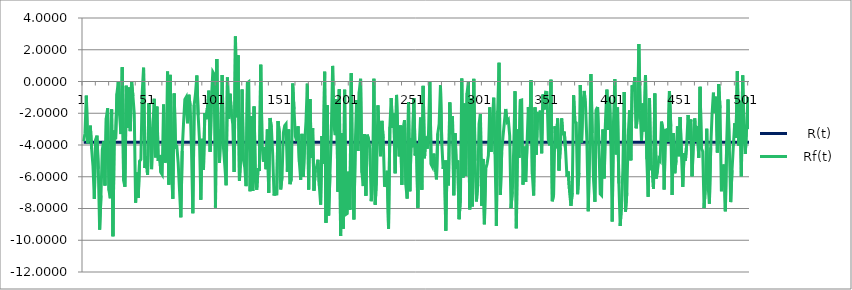
| Category |     R(t) |    Rf(t) |
|---|---|---|
| 0 | -3.82 | -3.77 |
| 1 | -3.82 | -3.253 |
| 2 | -3.82 | -0.888 |
| 3 | -3.82 | -3.89 |
| 4 | -3.82 | -3.398 |
| 5 | -3.82 | -2.78 |
| 6 | -3.82 | -4.243 |
| 7 | -3.82 | -5.334 |
| 8 | -3.82 | -7.394 |
| 9 | -3.82 | -3.652 |
| 10 | -3.82 | -3.412 |
| 11 | -3.82 | -5.506 |
| 12 | -3.82 | -9.331 |
| 13 | -3.82 | -7.177 |
| 14 | -3.82 | -4.293 |
| 15 | -3.82 | -3.78 |
| 16 | -3.82 | -6.547 |
| 17 | -3.82 | -2.295 |
| 18 | -3.82 | -1.691 |
| 19 | -3.82 | -6.859 |
| 20 | -3.82 | -7.35 |
| 21 | -3.82 | -1.757 |
| 22 | -3.82 | -9.746 |
| 23 | -3.82 | -3.085 |
| 24 | -3.82 | -3.636 |
| 25 | -3.82 | -0.752 |
| 26 | -3.82 | -0.033 |
| 27 | -3.82 | -2.132 |
| 28 | -3.82 | -3.308 |
| 29 | -3.82 | 0.895 |
| 30 | -3.82 | -6.239 |
| 31 | -3.82 | -6.629 |
| 32 | -3.82 | -0.265 |
| 33 | -3.82 | -2.911 |
| 34 | -3.82 | -0.381 |
| 35 | -3.82 | -3.126 |
| 36 | -3.82 | 0.019 |
| 37 | -3.82 | -0.925 |
| 38 | -3.82 | -2.024 |
| 39 | -3.82 | -7.632 |
| 40 | -3.82 | -5.738 |
| 41 | -3.82 | -7.324 |
| 42 | -3.82 | -5.008 |
| 43 | -3.82 | -4.906 |
| 44 | -3.82 | -0.662 |
| 45 | -3.82 | 0.871 |
| 46 | -3.82 | -5.452 |
| 47 | -3.82 | -4.727 |
| 48 | -3.82 | -5.891 |
| 49 | -3.82 | -1.372 |
| 50 | -3.82 | -3.266 |
| 51 | -3.82 | -5.519 |
| 52 | -3.82 | -2.876 |
| 53 | -3.82 | -1.092 |
| 54 | -3.82 | -4.779 |
| 55 | -3.82 | -1.58 |
| 56 | -3.82 | -5 |
| 57 | -3.82 | -4.629 |
| 58 | -3.82 | -5.729 |
| 59 | -3.82 | -5.864 |
| 60 | -3.82 | -1.45 |
| 61 | -3.82 | -5.109 |
| 62 | -3.82 | -4.922 |
| 63 | -3.82 | 0.625 |
| 64 | -3.82 | -6.495 |
| 65 | -3.82 | 0.418 |
| 66 | -3.82 | -5.81 |
| 67 | -3.82 | -7.392 |
| 68 | -3.82 | -0.758 |
| 69 | -3.82 | -4.139 |
| 70 | -3.82 | -4.095 |
| 71 | -3.82 | -5.137 |
| 72 | -3.82 | -6.862 |
| 73 | -3.82 | -8.555 |
| 74 | -3.82 | -4.374 |
| 75 | -3.82 | -2.66 |
| 76 | -3.82 | -1.125 |
| 77 | -3.82 | -0.984 |
| 78 | -3.82 | -2.628 |
| 79 | -3.82 | -0.837 |
| 80 | -3.82 | -1.535 |
| 81 | -3.82 | -4.315 |
| 82 | -3.82 | -8.296 |
| 83 | -3.82 | -1.484 |
| 84 | -3.82 | -0.774 |
| 85 | -3.82 | 0.378 |
| 86 | -3.82 | -2.13 |
| 87 | -3.82 | -3.709 |
| 88 | -3.82 | -7.444 |
| 89 | -3.82 | -3.612 |
| 90 | -3.82 | -5.557 |
| 91 | -3.82 | -1.986 |
| 92 | -3.82 | -2.376 |
| 93 | -3.82 | -1.616 |
| 94 | -3.82 | -0.576 |
| 95 | -3.82 | -4.42 |
| 96 | -3.82 | -1.086 |
| 97 | -3.82 | 0.612 |
| 98 | -3.82 | 0.468 |
| 99 | -3.82 | -7.944 |
| 100 | -3.82 | 1.419 |
| 101 | -3.82 | -3.698 |
| 102 | -3.82 | -5.135 |
| 103 | -3.82 | -3.002 |
| 104 | -3.82 | 0.41 |
| 105 | -3.82 | -4.165 |
| 106 | -3.82 | -5.272 |
| 107 | -3.82 | -6.535 |
| 108 | -3.82 | 0.251 |
| 109 | -3.82 | -2.34 |
| 110 | -3.82 | -0.771 |
| 111 | -3.82 | -2.041 |
| 112 | -3.82 | -2.675 |
| 113 | -3.82 | -5.699 |
| 114 | -3.82 | 2.84 |
| 115 | -3.82 | -2.253 |
| 116 | -3.82 | 1.648 |
| 117 | -3.82 | -6.251 |
| 118 | -3.82 | -4.736 |
| 119 | -3.82 | -0.503 |
| 120 | -3.82 | -4.949 |
| 121 | -3.82 | -5.396 |
| 122 | -3.82 | -6.592 |
| 123 | -3.82 | -0.079 |
| 124 | -3.82 | -0.015 |
| 125 | -3.82 | -6.909 |
| 126 | -3.82 | -2.176 |
| 127 | -3.82 | -6.892 |
| 128 | -3.82 | -1.577 |
| 129 | -3.82 | -6.271 |
| 130 | -3.82 | -6.815 |
| 131 | -3.82 | -5.451 |
| 132 | -3.82 | -5.644 |
| 133 | -3.82 | 1.057 |
| 134 | -3.82 | -3.941 |
| 135 | -3.82 | -5.048 |
| 136 | -3.82 | -4.12 |
| 137 | -3.82 | -5.522 |
| 138 | -3.82 | -3.023 |
| 139 | -3.82 | -7.015 |
| 140 | -3.82 | -2.302 |
| 141 | -3.82 | -2.893 |
| 142 | -3.82 | -4.617 |
| 143 | -3.82 | -7.183 |
| 144 | -3.82 | -6.876 |
| 145 | -3.82 | -7.164 |
| 146 | -3.82 | -2.496 |
| 147 | -3.82 | -3.234 |
| 148 | -3.82 | -6.798 |
| 149 | -3.82 | -6.018 |
| 150 | -3.82 | -3.233 |
| 151 | -3.82 | -2.776 |
| 152 | -3.82 | -2.671 |
| 153 | -3.82 | -5.691 |
| 154 | -3.82 | -3.025 |
| 155 | -3.82 | -6.466 |
| 156 | -3.82 | -6.135 |
| 157 | -3.82 | -0.128 |
| 158 | -3.82 | -1.76 |
| 159 | -3.82 | -3.446 |
| 160 | -3.82 | -3.754 |
| 161 | -3.82 | -2.828 |
| 162 | -3.82 | -5.065 |
| 163 | -3.82 | -6.19 |
| 164 | -3.82 | -3.3 |
| 165 | -3.82 | -5.998 |
| 166 | -3.82 | -3.9 |
| 167 | -3.82 | -2.504 |
| 168 | -3.82 | -0.136 |
| 169 | -3.82 | -6.801 |
| 170 | -3.82 | -1.109 |
| 171 | -3.82 | -4.819 |
| 172 | -3.82 | -2.936 |
| 173 | -3.82 | -6.874 |
| 174 | -3.82 | -5.535 |
| 175 | -3.82 | -5.355 |
| 176 | -3.82 | -4.931 |
| 177 | -3.82 | -6.556 |
| 178 | -3.82 | -7.757 |
| 179 | -3.82 | -3.431 |
| 180 | -3.82 | -5.187 |
| 181 | -3.82 | 0.614 |
| 182 | -3.82 | -8.897 |
| 183 | -3.82 | -1.496 |
| 184 | -3.82 | -8.439 |
| 185 | -3.82 | -5.838 |
| 186 | -3.82 | -3.305 |
| 187 | -3.82 | 0.982 |
| 188 | -3.82 | -2.844 |
| 189 | -3.82 | -3.378 |
| 190 | -3.82 | -1.103 |
| 191 | -3.82 | -6.95 |
| 192 | -3.82 | -0.482 |
| 193 | -3.82 | -9.737 |
| 194 | -3.82 | -3.256 |
| 195 | -3.82 | -9.268 |
| 196 | -3.82 | -0.513 |
| 197 | -3.82 | -8.365 |
| 198 | -3.82 | -8.305 |
| 199 | -3.82 | -5.678 |
| 200 | -3.82 | -8.071 |
| 201 | -3.82 | 0.524 |
| 202 | -3.82 | -6.609 |
| 203 | -3.82 | -8.688 |
| 204 | -3.82 | -4.058 |
| 205 | -3.82 | -1.17 |
| 206 | -3.82 | -4.378 |
| 207 | -3.82 | -0.626 |
| 208 | -3.82 | 0.168 |
| 209 | -3.82 | -5.749 |
| 210 | -3.82 | -6.587 |
| 211 | -3.82 | -3.31 |
| 212 | -3.82 | -7.196 |
| 213 | -3.82 | -3.353 |
| 214 | -3.82 | -3.643 |
| 215 | -3.82 | -4.248 |
| 216 | -3.82 | -7.538 |
| 217 | -3.82 | -6.139 |
| 218 | -3.82 | 0.171 |
| 219 | -3.82 | -7.759 |
| 220 | -3.82 | -5.974 |
| 221 | -3.82 | -1.506 |
| 222 | -3.82 | -3.344 |
| 223 | -3.82 | -4.708 |
| 224 | -3.82 | -2.483 |
| 225 | -3.82 | -3.586 |
| 226 | -3.82 | -6.63 |
| 227 | -3.82 | -6.35 |
| 228 | -3.82 | -5.622 |
| 229 | -3.82 | -9.268 |
| 230 | -3.82 | -2.849 |
| 231 | -3.82 | -1.036 |
| 232 | -3.82 | -2.923 |
| 233 | -3.82 | -2.018 |
| 234 | -3.82 | -5.78 |
| 235 | -3.82 | -0.845 |
| 236 | -3.82 | -3.515 |
| 237 | -3.82 | -4.714 |
| 238 | -3.82 | -2.77 |
| 239 | -3.82 | -6.503 |
| 240 | -3.82 | -2.958 |
| 241 | -3.82 | -2.442 |
| 242 | -3.82 | -6.51 |
| 243 | -3.82 | -7.374 |
| 244 | -3.82 | -1.302 |
| 245 | -3.82 | -6.91 |
| 246 | -3.82 | -3.573 |
| 247 | -3.82 | -4.138 |
| 248 | -3.82 | -1.049 |
| 249 | -3.82 | -4.658 |
| 250 | -3.82 | -3.928 |
| 251 | -3.82 | -7.949 |
| 252 | -3.82 | -4.167 |
| 253 | -3.82 | -2.267 |
| 254 | -3.82 | -6.82 |
| 255 | -3.82 | -0.275 |
| 256 | -3.82 | -4.83 |
| 257 | -3.82 | -3.47 |
| 258 | -3.82 | -4.223 |
| 259 | -3.82 | -3.343 |
| 260 | -3.82 | 0.008 |
| 261 | -3.82 | -5.218 |
| 262 | -3.82 | -5.386 |
| 263 | -3.82 | -4.537 |
| 264 | -3.82 | -5.431 |
| 265 | -3.82 | -6.164 |
| 266 | -3.82 | -3.27 |
| 267 | -3.82 | -2.675 |
| 268 | -3.82 | -0.232 |
| 269 | -3.82 | -3.901 |
| 270 | -3.82 | -5.511 |
| 271 | -3.82 | -4.982 |
| 272 | -3.82 | -9.393 |
| 273 | -3.82 | -4.971 |
| 274 | -3.82 | -6.542 |
| 275 | -3.82 | -1.324 |
| 276 | -3.82 | -3.317 |
| 277 | -3.82 | -2.173 |
| 278 | -3.82 | -7.16 |
| 279 | -3.82 | -3.257 |
| 280 | -3.82 | -5.511 |
| 281 | -3.82 | -4.978 |
| 282 | -3.82 | -8.672 |
| 283 | -3.82 | -7.352 |
| 284 | -3.82 | 0.184 |
| 285 | -3.82 | -6.045 |
| 286 | -3.82 | -1.388 |
| 287 | -3.82 | -5.952 |
| 288 | -3.82 | -0.721 |
| 289 | -3.82 | -0.022 |
| 290 | -3.82 | -8.055 |
| 291 | -3.82 | -1.064 |
| 292 | -3.82 | -7.866 |
| 293 | -3.82 | 0.165 |
| 294 | -3.82 | -4.993 |
| 295 | -3.82 | -7.556 |
| 296 | -3.82 | -6.484 |
| 297 | -3.82 | -2.661 |
| 298 | -3.82 | -2.045 |
| 299 | -3.82 | -7.831 |
| 300 | -3.82 | -4.877 |
| 301 | -3.82 | -8.996 |
| 302 | -3.82 | -5.508 |
| 303 | -3.82 | -5.186 |
| 304 | -3.82 | -4.659 |
| 305 | -3.82 | -1.631 |
| 306 | -3.82 | -4.433 |
| 307 | -3.82 | -2.444 |
| 308 | -3.82 | -1.019 |
| 309 | -3.82 | -4.574 |
| 310 | -3.82 | -9.102 |
| 311 | -3.82 | -1.844 |
| 312 | -3.82 | 1.177 |
| 313 | -3.82 | -7.144 |
| 314 | -3.82 | -4.458 |
| 315 | -3.82 | -3.441 |
| 316 | -3.82 | -2.577 |
| 317 | -3.82 | -1.733 |
| 318 | -3.82 | -2.526 |
| 319 | -3.82 | -2.414 |
| 320 | -3.82 | -3.429 |
| 321 | -3.82 | -7.979 |
| 322 | -3.82 | -6.923 |
| 323 | -3.82 | -4.325 |
| 324 | -3.82 | -0.62 |
| 325 | -3.82 | -9.243 |
| 326 | -3.82 | -3.019 |
| 327 | -3.82 | -4.806 |
| 328 | -3.82 | -1.19 |
| 329 | -3.82 | -1.165 |
| 330 | -3.82 | -6.495 |
| 331 | -3.82 | -4.099 |
| 332 | -3.82 | -6.332 |
| 333 | -3.82 | -4.022 |
| 334 | -3.82 | -1.612 |
| 335 | -3.82 | -3.738 |
| 336 | -3.82 | 0.073 |
| 337 | -3.82 | -5.828 |
| 338 | -3.82 | -7.179 |
| 339 | -3.82 | -1.631 |
| 340 | -3.82 | -4.604 |
| 341 | -3.82 | -2.037 |
| 342 | -3.82 | -2.113 |
| 343 | -3.82 | -1.832 |
| 344 | -3.82 | -4.517 |
| 345 | -3.82 | -0.821 |
| 346 | -3.82 | -1.761 |
| 347 | -3.82 | -0.68 |
| 348 | -3.82 | -0.696 |
| 349 | -3.82 | -3.64 |
| 350 | -3.82 | -4.025 |
| 351 | -3.82 | 0.115 |
| 352 | -3.82 | -7.541 |
| 353 | -3.82 | -7.135 |
| 354 | -3.82 | -2.813 |
| 355 | -3.82 | -4.2 |
| 356 | -3.82 | -2.328 |
| 357 | -3.82 | -5.611 |
| 358 | -3.82 | -4.151 |
| 359 | -3.82 | -2.322 |
| 360 | -3.82 | -3.382 |
| 361 | -3.82 | -3.161 |
| 362 | -3.82 | -4.352 |
| 363 | -3.82 | -5.992 |
| 364 | -3.82 | -5.666 |
| 365 | -3.82 | -6.979 |
| 366 | -3.82 | -7.829 |
| 367 | -3.82 | -7.014 |
| 368 | -3.82 | -0.866 |
| 369 | -3.82 | -2.562 |
| 370 | -3.82 | -2.61 |
| 371 | -3.82 | -7.1 |
| 372 | -3.82 | -5.766 |
| 373 | -3.82 | -0.226 |
| 374 | -3.82 | -3.841 |
| 375 | -3.82 | -1.343 |
| 376 | -3.82 | -0.597 |
| 377 | -3.82 | -1.58 |
| 378 | -3.82 | -3.81 |
| 379 | -3.82 | -8.168 |
| 380 | -3.82 | -4.39 |
| 381 | -3.82 | 0.467 |
| 382 | -3.82 | -3.253 |
| 383 | -3.82 | -6.228 |
| 384 | -3.82 | -7.574 |
| 385 | -3.82 | -1.789 |
| 386 | -3.82 | -1.605 |
| 387 | -3.82 | -3.971 |
| 388 | -3.82 | -7.077 |
| 389 | -3.82 | -7.165 |
| 390 | -3.82 | -3.024 |
| 391 | -3.82 | -6.102 |
| 392 | -3.82 | -2.376 |
| 393 | -3.82 | -0.513 |
| 394 | -3.82 | -3.059 |
| 395 | -3.82 | -0.987 |
| 396 | -3.82 | -3.799 |
| 397 | -3.82 | -8.822 |
| 398 | -3.82 | -2.467 |
| 399 | -3.82 | 0.148 |
| 400 | -3.82 | -4.59 |
| 401 | -3.82 | -1.637 |
| 402 | -3.82 | -6.429 |
| 403 | -3.82 | -9.102 |
| 404 | -3.82 | -7.77 |
| 405 | -3.82 | -5.577 |
| 406 | -3.82 | -0.663 |
| 407 | -3.82 | -8.193 |
| 408 | -3.82 | -7.007 |
| 409 | -3.82 | -3.431 |
| 410 | -3.82 | -1.819 |
| 411 | -3.82 | -4.966 |
| 412 | -3.82 | -0.244 |
| 413 | -3.82 | -0.611 |
| 414 | -3.82 | 0.271 |
| 415 | -3.82 | -2.945 |
| 416 | -3.82 | -2.177 |
| 417 | -3.82 | 2.364 |
| 418 | -3.82 | -1.836 |
| 419 | -3.82 | -3.728 |
| 420 | -3.82 | -1.385 |
| 421 | -3.82 | -3.142 |
| 422 | -3.82 | 0.391 |
| 423 | -3.82 | -4.896 |
| 424 | -3.82 | -7.263 |
| 425 | -3.82 | -1.048 |
| 426 | -3.82 | -5.586 |
| 427 | -3.82 | -5.285 |
| 428 | -3.82 | -6.749 |
| 429 | -3.82 | -0.76 |
| 430 | -3.82 | -6.115 |
| 431 | -3.82 | -5.611 |
| 432 | -3.82 | -4.873 |
| 433 | -3.82 | -4.99 |
| 434 | -3.82 | -2.527 |
| 435 | -3.82 | -2.978 |
| 436 | -3.82 | -6.803 |
| 437 | -3.82 | -3.068 |
| 438 | -3.82 | -3.032 |
| 439 | -3.82 | -3.813 |
| 440 | -3.82 | -0.604 |
| 441 | -3.82 | -2.835 |
| 442 | -3.82 | -7.154 |
| 443 | -3.82 | -3.242 |
| 444 | -3.82 | -5.775 |
| 445 | -3.82 | -4.96 |
| 446 | -3.82 | -2.824 |
| 447 | -3.82 | -4.708 |
| 448 | -3.82 | -2.234 |
| 449 | -3.82 | -4.524 |
| 450 | -3.82 | -6.64 |
| 451 | -3.82 | -4.513 |
| 452 | -3.82 | -4.989 |
| 453 | -3.82 | -3.867 |
| 454 | -3.82 | -2.108 |
| 455 | -3.82 | -3.676 |
| 456 | -3.82 | -2.399 |
| 457 | -3.82 | -5.966 |
| 458 | -3.82 | -3.726 |
| 459 | -3.82 | -2.323 |
| 460 | -3.82 | -3.809 |
| 461 | -3.82 | -2.829 |
| 462 | -3.82 | -4.807 |
| 463 | -3.82 | -0.337 |
| 464 | -3.82 | -4.218 |
| 465 | -3.82 | -4.408 |
| 466 | -3.82 | -7.973 |
| 467 | -3.82 | -6.589 |
| 468 | -3.82 | -2.974 |
| 469 | -3.82 | -6.523 |
| 470 | -3.82 | -7.698 |
| 471 | -3.82 | -4.158 |
| 472 | -3.82 | -2.08 |
| 473 | -3.82 | -0.706 |
| 474 | -3.82 | -1.974 |
| 475 | -3.82 | -0.958 |
| 476 | -3.82 | -4.468 |
| 477 | -3.82 | -0.156 |
| 478 | -3.82 | -1.694 |
| 479 | -3.82 | -6.916 |
| 480 | -3.82 | -5.444 |
| 481 | -3.82 | -5.233 |
| 482 | -3.82 | -8.169 |
| 483 | -3.82 | -3.826 |
| 484 | -3.82 | -1.139 |
| 485 | -3.82 | -4.229 |
| 486 | -3.82 | -7.596 |
| 487 | -3.82 | -5.59 |
| 488 | -3.82 | -4.052 |
| 489 | -3.82 | -2.631 |
| 490 | -3.82 | -3.558 |
| 491 | -3.82 | 0.654 |
| 492 | -3.82 | -4.037 |
| 493 | -3.82 | -1.218 |
| 494 | -3.82 | -5.966 |
| 495 | -3.82 | 0.385 |
| 496 | -3.82 | -3.363 |
| 497 | -3.82 | -4.56 |
| 498 | -3.82 | -2.718 |
| 499 | -3.82 | -0.976 |
| 500 | -3.82 | -2.998 |